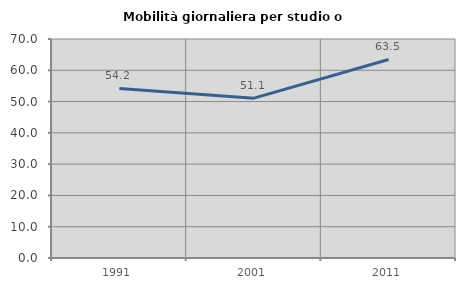
| Category | Mobilità giornaliera per studio o lavoro |
|---|---|
| 1991.0 | 54.189 |
| 2001.0 | 51.087 |
| 2011.0 | 63.468 |